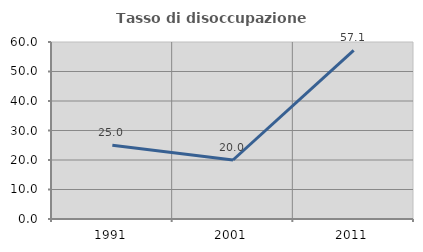
| Category | Tasso di disoccupazione giovanile  |
|---|---|
| 1991.0 | 25 |
| 2001.0 | 20 |
| 2011.0 | 57.143 |